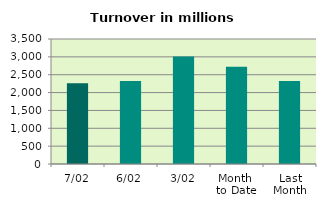
| Category | Series 0 |
|---|---|
| 7/02 | 2263.408 |
| 6/02 | 2323.381 |
| 3/02 | 3012.869 |
| Month 
to Date | 2721.448 |
| Last
Month | 2326.675 |